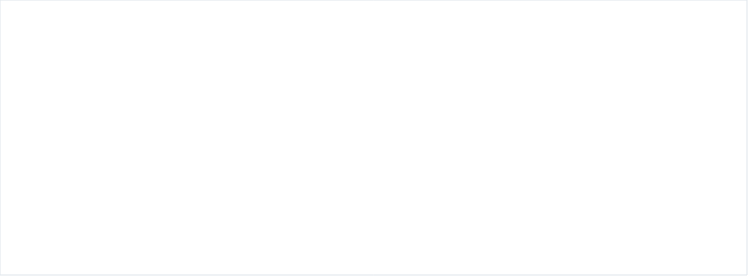
| Category | CXP CONSTITUIDAS | CANCELACIONES CXP | TOTAL PAGOS |
|---|---|---|---|
| A-FUNCIONAMIENTO | 7893.785 | 0 | 6858.44 |
| C-INVERSIÓN | 182.429 | 0 | 182.429 |